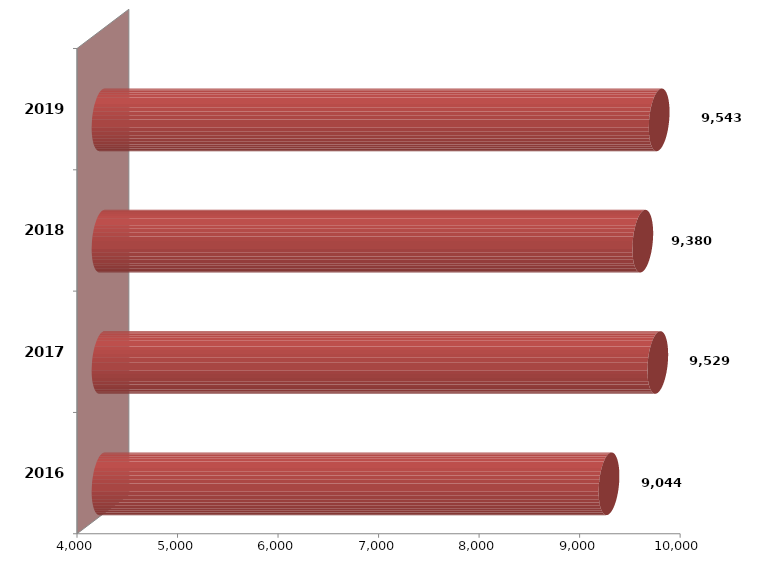
| Category | Series 1 | Series 2 |
|---|---|---|
| 2016.0 | 9043605.283 |  |
| 2017.0 | 9528784.616 |  |
| 2018.0 | 9379792.504 |  |
| 2019.0 | 9542655.621 |  |